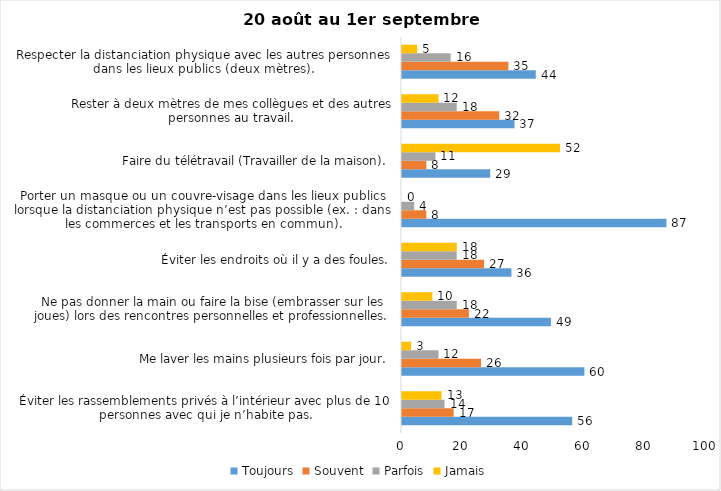
| Category | Toujours | Souvent | Parfois | Jamais |
|---|---|---|---|---|
| Éviter les rassemblements privés à l’intérieur avec plus de 10 personnes avec qui je n’habite pas. | 56 | 17 | 14 | 13 |
| Me laver les mains plusieurs fois par jour. | 60 | 26 | 12 | 3 |
| Ne pas donner la main ou faire la bise (embrasser sur les joues) lors des rencontres personnelles et professionnelles. | 49 | 22 | 18 | 10 |
| Éviter les endroits où il y a des foules. | 36 | 27 | 18 | 18 |
| Porter un masque ou un couvre-visage dans les lieux publics lorsque la distanciation physique n’est pas possible (ex. : dans les commerces et les transports en commun). | 87 | 8 | 4 | 0 |
| Faire du télétravail (Travailler de la maison). | 29 | 8 | 11 | 52 |
| Rester à deux mètres de mes collègues et des autres personnes au travail. | 37 | 32 | 18 | 12 |
| Respecter la distanciation physique avec les autres personnes dans les lieux publics (deux mètres). | 44 | 35 | 16 | 5 |